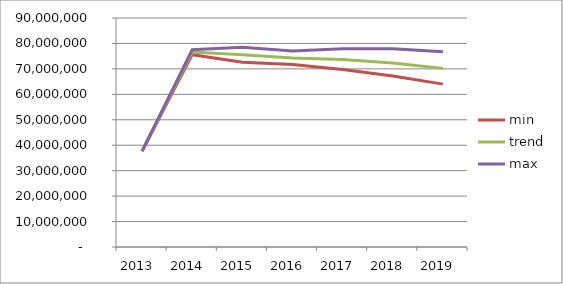
| Category |  min  |  trend  |  max  |
|---|---|---|---|
| 2013.0 | 37651939.622 | 37651939.622 | 37651939.622 |
| 2014.0 | 75592324.737 | 76590706.535 | 77493623.036 |
| 2015.0 | 72644567.425 | 75603176.245 | 78550760.372 |
| 2016.0 | 71709014.249 | 74261508.234 | 77076094.992 |
| 2017.0 | 69799823.669 | 73727711.901 | 77955593.141 |
| 2018.0 | 67244321.965 | 72322146.263 | 77866139.298 |
| 2019.0 | 64009805.268 | 70202710.023 | 76693634.732 |